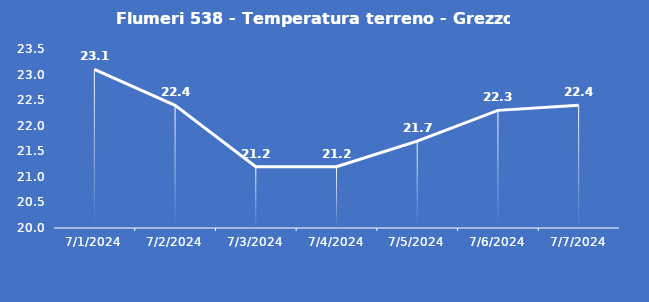
| Category | Flumeri 538 - Temperatura terreno - Grezzo (°C) |
|---|---|
| 7/1/24 | 23.1 |
| 7/2/24 | 22.4 |
| 7/3/24 | 21.2 |
| 7/4/24 | 21.2 |
| 7/5/24 | 21.7 |
| 7/6/24 | 22.3 |
| 7/7/24 | 22.4 |